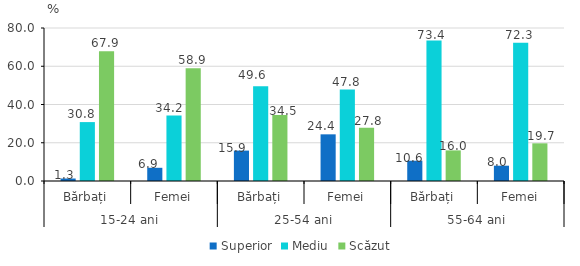
| Category | Superior | Mediu | Scăzut |
|---|---|---|---|
| 0 | 1.3 | 30.8 | 67.9 |
| 1 | 6.9 | 34.2 | 58.9 |
| 2 | 15.9 | 49.6 | 34.5 |
| 3 | 24.4 | 47.8 | 27.8 |
| 4 | 10.6 | 73.4 | 16 |
| 5 | 8 | 72.3 | 19.7 |